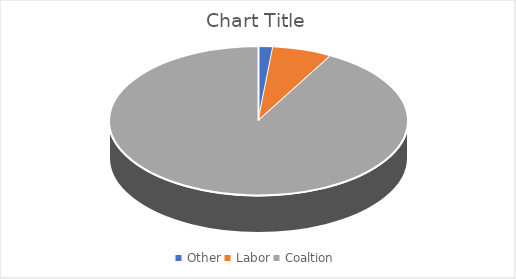
| Category | Series 0 |
|---|---|
| Other | 42200 |
| Labor | 173986.3 |
| Coaltion | 2459320.08 |